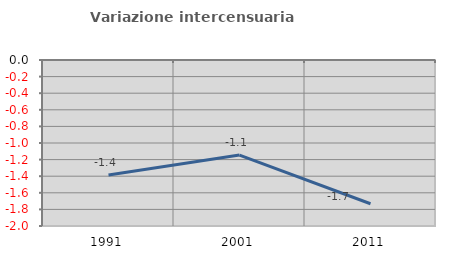
| Category | Variazione intercensuaria annua |
|---|---|
| 1991.0 | -1.385 |
| 2001.0 | -1.146 |
| 2011.0 | -1.732 |